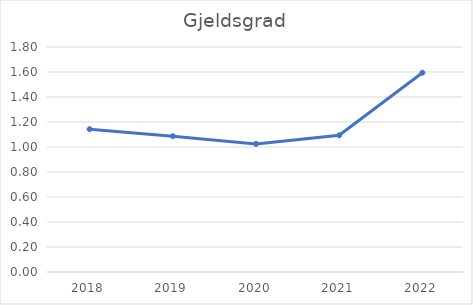
| Category | Gjeldsgrad |
|---|---|
| 2018.0 | 1.142 |
| 2019.0 | 1.087 |
| 2020.0 | 1.025 |
| 2021.0 | 1.094 |
| 2022.0 | 1.594 |